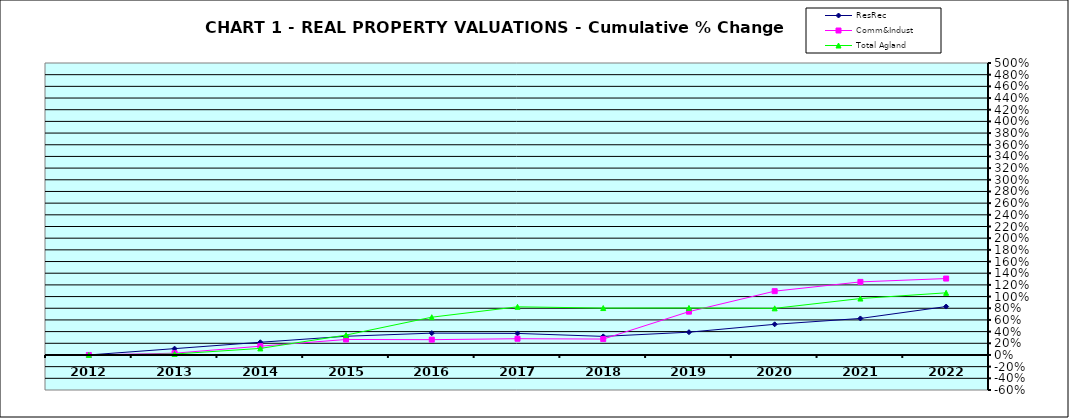
| Category | ResRec | Comm&Indust | Total Agland |
|---|---|---|---|
| 2012.0 | 0 | 0 | 0 |
| 2013.0 | 0.108 | 0.03 | 0.017 |
| 2014.0 | 0.217 | 0.15 | 0.112 |
| 2015.0 | 0.32 | 0.265 | 0.34 |
| 2016.0 | 0.374 | 0.262 | 0.647 |
| 2017.0 | 0.369 | 0.278 | 0.825 |
| 2018.0 | 0.318 | 0.272 | 0.803 |
| 2019.0 | 0.39 | 0.742 | 0.805 |
| 2020.0 | 0.525 | 1.093 | 0.799 |
| 2021.0 | 0.625 | 1.251 | 0.966 |
| 2022.0 | 0.829 | 1.309 | 1.064 |